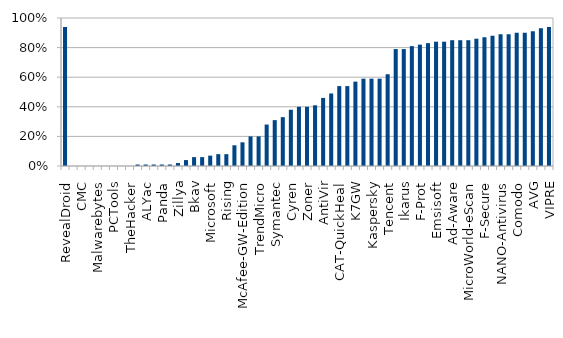
| Category | Series 0 |
|---|---|
| RevealDroid | 0.94 |
| ByteHero | 0 |
| CMC | 0 |
| K7AntiVirus | 0 |
| Malwarebytes | 0 |
| nProtect | 0 |
| PCTools | 0 |
| SUPERAntiSpyware | 0 |
| TheHacker | 0 |
| Agnitum | 0.01 |
| ALYac | 0.01 |
| Antiy-AVL | 0.01 |
| Panda | 0.01 |
| ViRobot | 0.01 |
| Zillya | 0.02 |
| Norman | 0.04 |
| Bkav | 0.06 |
| VBA32 | 0.06 |
| Microsoft | 0.07 |
| ClamAV | 0.08 |
| Rising | 0.08 |
| Alibaba | 0.14 |
| McAfee-GW-Edition | 0.16 |
| Jiangmin | 0.2 |
| TrendMicro | 0.2 |
| TotalDefense | 0.28 |
| Symantec | 0.31 |
| Commtouch | 0.33 |
| Cyren | 0.38 |
| TrendMicro-HouseCall | 0.4 |
| Zoner | 0.4 |
| AegisLab | 0.41 |
| AntiVir | 0.46 |
| Avira | 0.49 |
| CAT-QuickHeal | 0.54 |
| Kingsoft | 0.54 |
| K7GW | 0.57 |
| Avast | 0.59 |
| Kaspersky | 0.59 |
| Qihoo-360 | 0.59 |
| Tencent | 0.62 |
| DrWeb | 0.79 |
| Ikarus | 0.79 |
| AVware | 0.81 |
| F-Prot | 0.82 |
| AhnLab-V3 | 0.83 |
| Emsisoft | 0.84 |
| Fortinet | 0.84 |
| Ad-Aware | 0.85 |
| BitDefender | 0.85 |
| MicroWorld-eScan | 0.85 |
| GData | 0.86 |
| F-Secure | 0.87 |
| Baidu-International | 0.88 |
| NANO-Antivirus | 0.89 |
| Sophos | 0.89 |
| Comodo | 0.9 |
| McAfee | 0.9 |
| AVG | 0.91 |
| ESET-NOD32 | 0.93 |
| VIPRE | 0.94 |